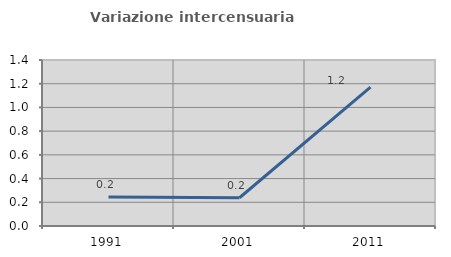
| Category | Variazione intercensuaria annua |
|---|---|
| 1991.0 | 0.244 |
| 2001.0 | 0.238 |
| 2011.0 | 1.172 |